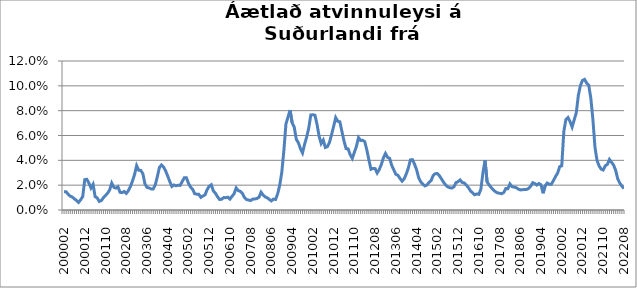
| Category | Series 0 |
|---|---|
| 200002 | 0.015 |
| 200003 | 0.015 |
| 200004 | 0.013 |
| 200005 | 0.011 |
| 200006 | 0.01 |
| 200007 | 0.009 |
| 200008 | 0.008 |
| 200009 | 0.006 |
| 200010 | 0.008 |
| 200011 | 0.011 |
| 200012 | 0.024 |
| 200101 | 0.025 |
| 200102 | 0.022 |
| 200103 | 0.018 |
| 200104 | 0.021 |
| 200105 | 0.011 |
| 200106 | 0.01 |
| 200107 | 0.007 |
| 200108 | 0.008 |
| 200109 | 0.01 |
| 200110 | 0.012 |
| 200111 | 0.014 |
| 200112 | 0.016 |
| 200201 | 0.022 |
| 200202 | 0.018 |
| 200203 | 0.018 |
| 200204 | 0.019 |
| 200205 | 0.014 |
| 200206 | 0.014 |
| 200207 | 0.015 |
| 200208 | 0.013 |
| 200209 | 0.015 |
| 200210 | 0.019 |
| 200211 | 0.023 |
| 200212 | 0.029 |
| 200301 | 0.036 |
| 200302 | 0.032 |
| 200303 | 0.032 |
| 200304 | 0.029 |
| 200305 | 0.021 |
| 200306 | 0.018 |
| 200307 | 0.018 |
| 200308 | 0.017 |
| 200309 | 0.017 |
| 200310 | 0.02 |
| 200311 | 0.027 |
| 200312 | 0.034 |
| 200401 | 0.036 |
| 200402 | 0.035 |
| 200403 | 0.031 |
| 200404 | 0.027 |
| 200405 | 0.023 |
| 200406 | 0.019 |
| 200407 | 0.02 |
| 200408 | 0.019 |
| 200409 | 0.02 |
| 200410 | 0.02 |
| 200411 | 0.023 |
| 200412 | 0.026 |
| 200501 | 0.026 |
| 200502 | 0.022 |
| 200503 | 0.018 |
| 200504 | 0.017 |
| 200505 | 0.013 |
| 200506 | 0.013 |
| 200507 | 0.013 |
| 200508 | 0.01 |
| 200509 | 0.011 |
| 200510 | 0.012 |
| 200511 | 0.016 |
| 200512 | 0.019 |
| 200601 | 0.02 |
| 200602 | 0.015 |
| 200603 | 0.013 |
| 200604 | 0.011 |
| 200605 | 0.008 |
| 200606 | 0.009 |
| 200607 | 0.01 |
| 200608 | 0.01 |
| 200609 | 0.01 |
| 200610 | 0.009 |
| 200611 | 0.011 |
| 200612 | 0.013 |
| 200701 | 0.018 |
| 200702 | 0.016 |
| 200703 | 0.015 |
| 200704 | 0.013 |
| 200705 | 0.01 |
| 200706 | 0.008 |
| 200707 | 0.008 |
| 200708 | 0.008 |
| 200709 | 0.009 |
| 200710 | 0.009 |
| 200711 | 0.009 |
| 200712 | 0.01 |
| 200801 | 0.014 |
| 200802 | 0.012 |
| 200803 | 0.011 |
| 200804 | 0.01 |
| 200805 | 0.008 |
| 200806 | 0.007 |
| 200807 | 0.009 |
| 200808 | 0.008 |
| 200809 | 0.013 |
| 200810 | 0.02 |
| 200811 | 0.03 |
| 200812 | 0.048 |
| 200901 | 0.069 |
| 200902 | 0.075 |
| 200903 | 0.08 |
| 200904 | 0.07 |
| 200905 | 0.067 |
| 200906 | 0.057 |
| 200907 | 0.054 |
| 200908 | 0.049 |
| 200909 | 0.046 |
| 200910 | 0.053 |
| 200911 | 0.059 |
| 200912 | 0.066 |
| 201001 | 0.077 |
| 201002 | 0.077 |
| 201003 | 0.076 |
| 201004 | 0.069 |
| 201005 | 0.059 |
| 201006 | 0.053 |
| 201007 | 0.056 |
| 201008 | 0.05 |
| 201009 | 0.051 |
| 201010 | 0.054 |
| 201011 | 0.061 |
| 201012 | 0.067 |
| 201101 | 0.074 |
| 201102 | 0.071 |
| 201103 | 0.071 |
| 201104 | 0.063 |
| 201105 | 0.056 |
| 201106 | 0.049 |
| 201107 | 0.049 |
| 201108 | 0.044 |
| 201109 | 0.042 |
| 201110 | 0.046 |
| 201111 | 0.051 |
| 201112 | 0.058 |
| 201201 | 0.056 |
| 201202 | 0.056 |
| 201203 | 0.055 |
| 201204 | 0.048 |
| 201205 | 0.04 |
| 201206 | 0.033 |
| 201207 | 0.033 |
| 201208 | 0.033 |
| 201209 | 0.03 |
| 201210 | 0.033 |
| 201211 | 0.037 |
| 201212 | 0.042 |
| 201301 | 0.046 |
| 201302 | 0.042 |
| 201303 | 0.042 |
| 201304 | 0.036 |
| 201305 | 0.032 |
| 201306 | 0.029 |
| 201307 | 0.028 |
| 201308 | 0.025 |
| 201309 | 0.023 |
| 201310 | 0.025 |
| 201311 | 0.029 |
| 201312 | 0.034 |
| 201401 | 0.04 |
| 201402 | 0.041 |
| 201403 | 0.037 |
| 201404 | 0.032 |
| 201405 | 0.026 |
| 201406 | 0.023 |
| 201407 | 0.021 |
| 201408 | 0.019 |
| 201409 | 0.02 |
| 201410 | 0.022 |
| 201411 | 0.024 |
| 201412 | 0.028 |
| 201501 | 0.029 |
| 201502 | 0.029 |
| 201503 | 0.028 |
| 201504 | 0.025 |
| 201505 | 0.022 |
| 201506 | 0.02 |
| 201507 | 0.019 |
| 201508 | 0.018 |
| 201509 | 0.018 |
| 201510 | 0.019 |
| 201511 | 0.022 |
| 201512 | 0.023 |
| 201601 | 0.024 |
| 201602 | 0.022 |
| 201603 | 0.022 |
| 201604 | 0.02 |
| 201605 | 0.018 |
| 201606 | 0.015 |
| 201607 | 0.014 |
| 201608 | 0.012 |
| 201609 | 0.013 |
| 201610 | 0.013 |
| 201611 | 0.017 |
| 201612 | 0.03 |
| 201701 | 0.04 |
| 201702 | 0.023 |
| 201703 | 0.02 |
| 201704 | 0.018 |
| 201705 | 0.016 |
| 201706 | 0.015 |
| 201707 | 0.014 |
| 201708 | 0.014 |
| 201709 | 0.013 |
| 201710 | 0.014 |
| 201711 | 0.017 |
| 201712 | 0.017 |
| 201801 | 0.021 |
| 201802 | 0.019 |
| 201803 | 0.018 |
| 201804 | 0.018 |
| 201805 | 0.017 |
| 201806 | 0.016 |
| 201807 | 0.016 |
| 201808 | 0.017 |
| 201809 | 0.017 |
| 201810 | 0.017 |
| 201811 | 0.019 |
| 201812 | 0.022 |
| 201901 | 0.021 |
| 201902 | 0.02 |
| 201903 | 0.021 |
| 201904 | 0.02 |
| 201905 | 0.013 |
| 201906 | 0.02 |
| 201907 | 0.022 |
| 201908 | 0.021 |
| 201909 | 0.021 |
| 201910 | 0.024 |
| 201911 | 0.027 |
| 201912 | 0.03 |
| 202001(a) | 0.035 |
| 202002 | 0.036 |
| 202003***  | 0.063 |
| 202004 | 0.073 |
| 202005 | 0.075 |
| 202006 | 0.071 |
| 202007 | 0.067 |
| 202008 | 0.073 |
| 202009 | 0.078 |
| 202010 | 0.092 |
| 202011 | 0.1 |
| 202012 | 0.104 |
| 202101 | 0.105 |
| 202102 | 0.102 |
| 202103 | 0.101 |
| 202104 | 0.09 |
| 202105 | 0.073 |
| 202106 | 0.051 |
| 202107 | 0.04 |
| 202108 | 0.036 |
| 202109 | 0.033 |
| 202110 | 0.032 |
| 202111 | 0.036 |
| 202112 | 0.037 |
| 202201 | 0.041 |
| 202202 | 0.038 |
| 202203 | 0.036 |
| 202204 | 0.032 |
| 202205 | 0.025 |
| 202206 | 0.022 |
| 202207 | 0.019 |
| 202208 | 0.017 |